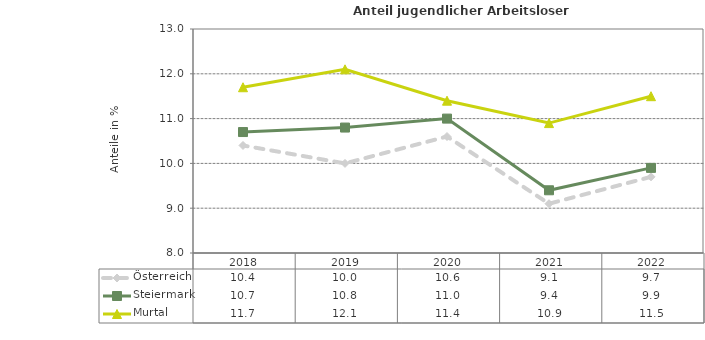
| Category | Österreich | Steiermark | Murtal |
|---|---|---|---|
| 2022.0 | 9.7 | 9.9 | 11.5 |
| 2021.0 | 9.1 | 9.4 | 10.9 |
| 2020.0 | 10.6 | 11 | 11.4 |
| 2019.0 | 10 | 10.8 | 12.1 |
| 2018.0 | 10.4 | 10.7 | 11.7 |